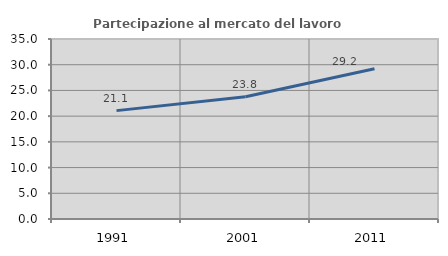
| Category | Partecipazione al mercato del lavoro  femminile |
|---|---|
| 1991.0 | 21.072 |
| 2001.0 | 23.755 |
| 2011.0 | 29.214 |